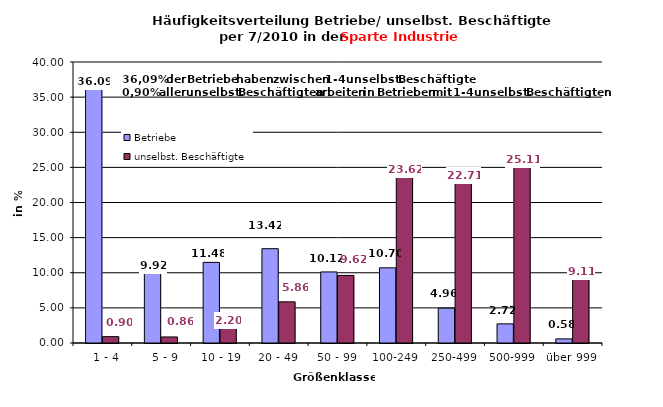
| Category | Betriebe | unselbst. Beschäftigte |
|---|---|---|
|   1 - 4 | 36.089 | 0.904 |
|   5 - 9 | 9.922 | 0.859 |
|  10 - 19 | 11.479 | 2.2 |
| 20 - 49 | 13.424 | 5.862 |
| 50 - 99 | 10.117 | 9.617 |
| 100-249 | 10.7 | 23.622 |
| 250-499 | 4.961 | 22.713 |
| 500-999 | 2.724 | 25.111 |
| über 999 | 0.584 | 9.112 |